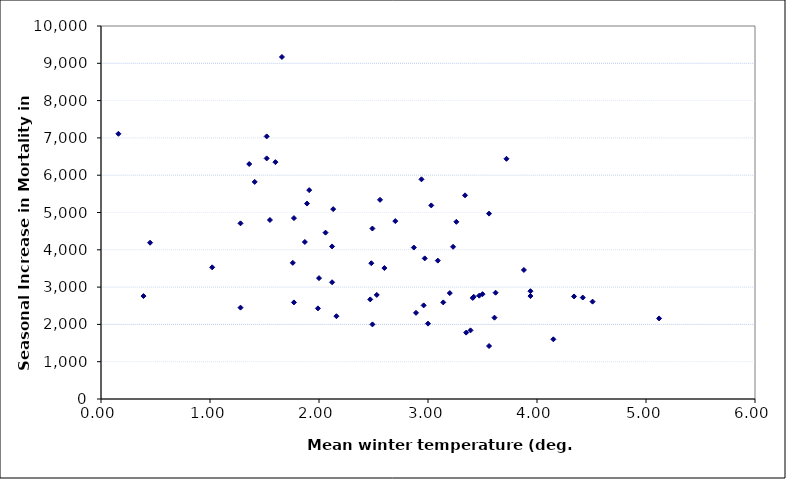
| Category | Seas Incr. Mort. |
|---|---|
| 1.89 | 5240 |
| 2.94 | 5890 |
| 2.7 | 4770 |
| 1.41 | 5820 |
| 1.52 | 6450 |
| 3.47 | 2770 |
| 2.06 | 4460 |
| 1.66 | 9170 |
| 2.12 | 4090 |
| 2.56 | 5340 |
| 2.13 | 5090 |
| 0.16 | 7110 |
| 3.09 | 3710 |
| 1.87 | 4210 |
| 1.6 | 6350 |
| 3.0 | 2020 |
| 1.91 | 5600 |
| 1.55 | 4800 |
| 1.52 | 7040 |
| 3.41 | 2710 |
| 3.56 | 4970 |
| 3.23 | 4080 |
| 3.5 | 2810 |
| 3.88 | 3460 |
| 3.72 | 6440 |
| 1.02 | 3530 |
| 1.77 | 4850 |
| 0.45 | 4190 |
| 2.47 | 2670 |
| 2.97 | 3770 |
| 1.36 | 6300 |
| 2.49 | 4570 |
| 2.53 | 2790 |
| 2.12 | 3130 |
| 1.28 | 4710 |
| 2.0 | 3240 |
| 3.14 | 2590 |
| 5.12 | 2160 |
| 3.34 | 5460 |
| 1.99 | 2430 |
| 3.94 | 2890 |
| 3.42 | 2740 |
| 1.77 | 2590 |
| 2.89 | 2310 |
| 1.76 | 3650 |
| 2.48 | 3640 |
| 4.51 | 2610 |
| 3.26 | 4750 |
| 3.03 | 5190 |
| 2.16 | 2220 |
| 3.39 | 1840 |
| 2.96 | 2510 |
| 3.2 | 2840 |
| 3.94 | 2760 |
| 3.35 | 1780 |
| 4.34 | 2750 |
| 3.61 | 2180 |
| 2.6 | 3510 |
| 0.39 | 2760 |
| 1.28 | 2450 |
| 3.56 | 1420 |
| 2.49 | 2000 |
| 4.15 | 1600 |
| 2.87 | 4060 |
| 3.62 | 2850 |
| 4.42 | 2720 |